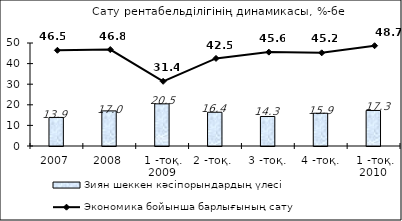
| Category | Зиян шеккен кәсіпорындардың үлесі |
|---|---|
| 2007 | 13.871 |
| 2008 | 17.036 |
| 1 -тоқ. 2009 | 20.469 |
| 2 -тоқ.  | 16.39 |
| 3 -тоқ. | 14.325 |
| 4 -тоқ. | 15.902 |
| 1 -тоқ. 2010  | 17.254 |